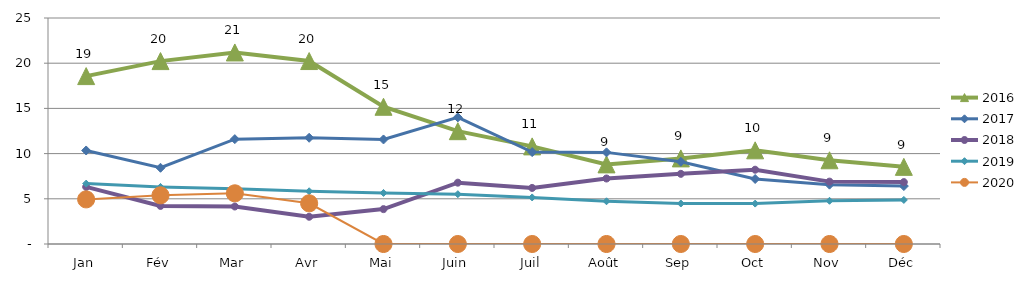
| Category | 2015 | 2016 | 2017 | 2018 | 2019 | 2020 |
|---|---|---|---|---|---|---|
| Jan |  | 18.573 | 10.345 | 6.315 | 6.68 | 4.936 |
| Fév |  | 20.232 | 8.433 | 4.213 | 6.315 | 5.385 |
| Mar |  | 21.188 | 11.601 | 4.15 | 6.109 | 5.606 |
| Avr |  | 20.238 | 11.751 | 3.014 | 5.832 | 4.501 |
| Mai |  | 15.18 | 11.565 | 3.859 | 5.648 | 0 |
| Juin |  | 12.479 | 14.003 | 6.784 | 5.512 | 0 |
| Juil |  | 10.799 | 10.166 | 6.203 | 5.152 | 0 |
| Août |  | 8.807 | 10.134 | 7.245 | 4.728 | 0 |
| Sep |  | 9.47 | 9.094 | 7.761 | 4.477 | 0 |
| Oct |  | 10.362 | 7.192 | 8.218 | 4.47 | 0 |
| Nov |  | 9.261 | 6.564 | 6.9 | 4.782 | 0 |
| Déc |  | 8.534 | 6.409 | 6.846 | 4.875 | 0 |